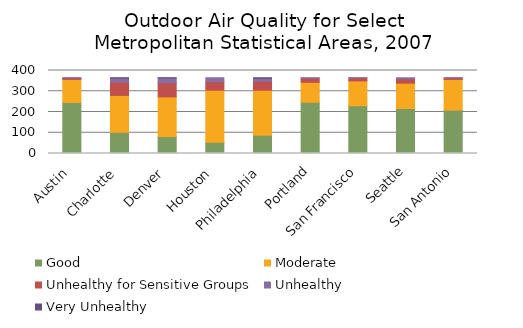
| Category | Good | Moderate | Unhealthy for Sensitive Groups | Unhealthy   | Very Unhealthy |
|---|---|---|---|---|---|
| Austin | 246 | 111 | 7 | 1 | 0 |
| Charlotte | 102 | 178 | 64 | 19 | 2 |
| Denver | 82 | 191 | 68 | 23 | 1 |
| Houston | 54 | 251 | 41 | 19 | 0 |
| Philadelphia | 88 | 217 | 43 | 14 | 3 |
| Portland | 247 | 96 | 20 | 2 | 0 |
| San Francisco | 230 | 120 | 14 | 1 | 0 |
| Seattle | 217 | 122 | 21 | 5 | 0 |
| San Antonio | 209 | 148 | 7 | 1 | 0 |